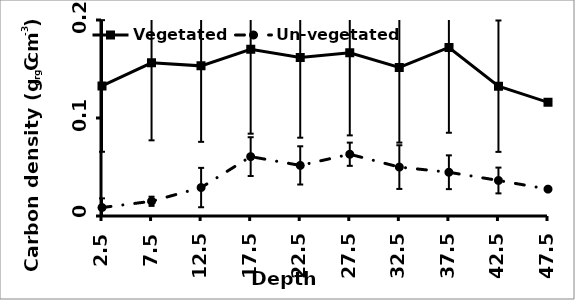
| Category | Vegetated | Un-vegetated |
|---|---|---|
| 2.5 | 0.133 | 0.009 |
| 7.5 | 0.156 | 0.015 |
| 12.5 | 0.153 | 0.029 |
| 17.5 | 0.17 | 0.061 |
| 22.5 | 0.162 | 0.052 |
| 27.5 | 0.167 | 0.063 |
| 32.5 | 0.152 | 0.05 |
| 37.5 | 0.172 | 0.045 |
| 42.5 | 0.132 | 0.036 |
| 47.5 | 0.116 | 0.027 |